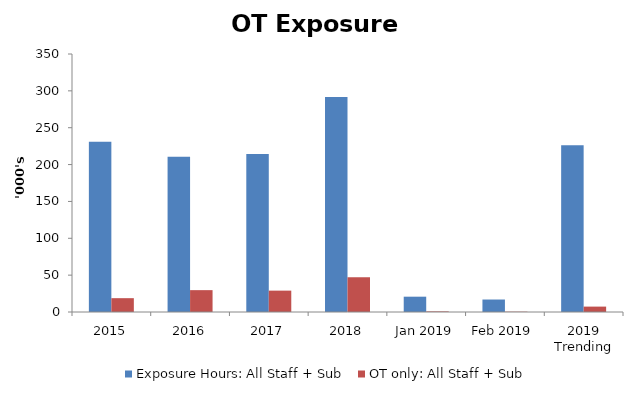
| Category | Exposure Hours: All Staff + Sub | OT only: All Staff + Sub |
|---|---|---|
| 2015 | 231066 | 18760 |
| 2016 | 210544 | 29652 |
| 2017 | 214425 | 28993 |
| 2018 | 291680 | 47142 |
| Jan 2019 | 20779 | 802 |
| Feb 2019 | 16928 | 418 |
| 2019 Trending | 226242 | 7320 |